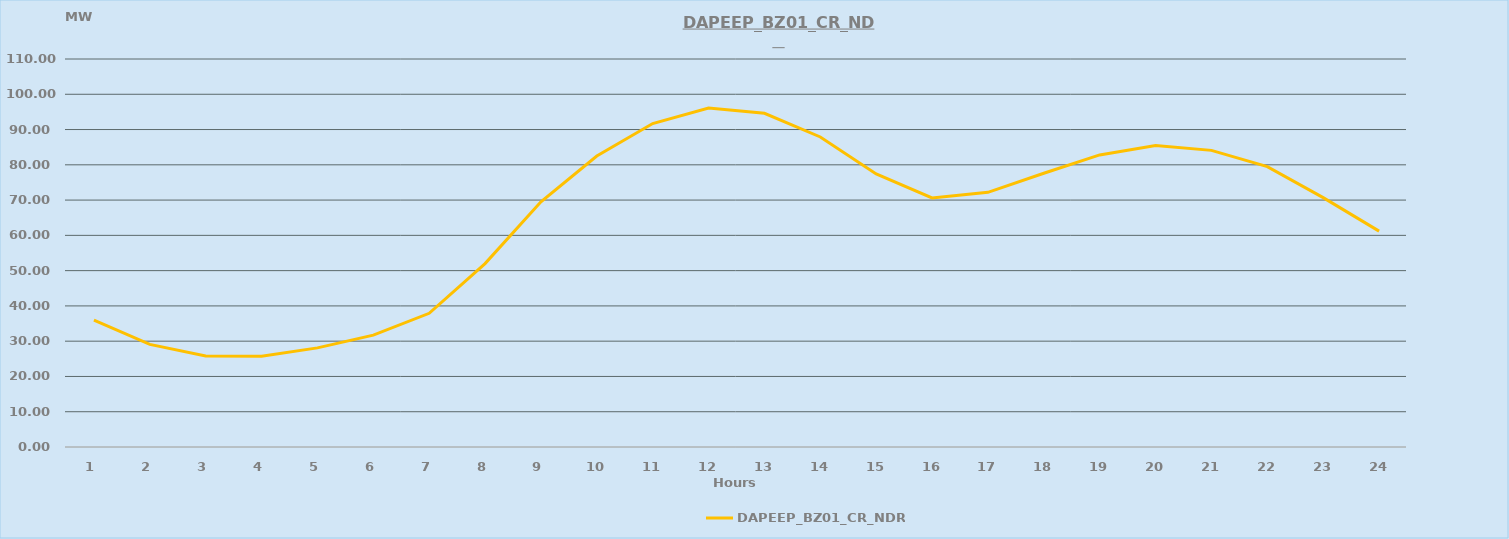
| Category | DAPEEP_BZ01_CR_NDR |
|---|---|
| 0 | 36 |
| 1 | 29.1 |
| 2 | 25.8 |
| 3 | 25.7 |
| 4 | 28.1 |
| 5 | 31.7 |
| 6 | 37.9 |
| 7 | 52 |
| 8 | 69.5 |
| 9 | 82.5 |
| 10 | 91.7 |
| 11 | 96.1 |
| 12 | 94.6 |
| 13 | 87.9 |
| 14 | 77.4 |
| 15 | 70.6 |
| 16 | 72.2 |
| 17 | 77.6 |
| 18 | 82.8 |
| 19 | 85.5 |
| 20 | 84.1 |
| 21 | 79.5 |
| 22 | 70.7 |
| 23 | 61.2 |